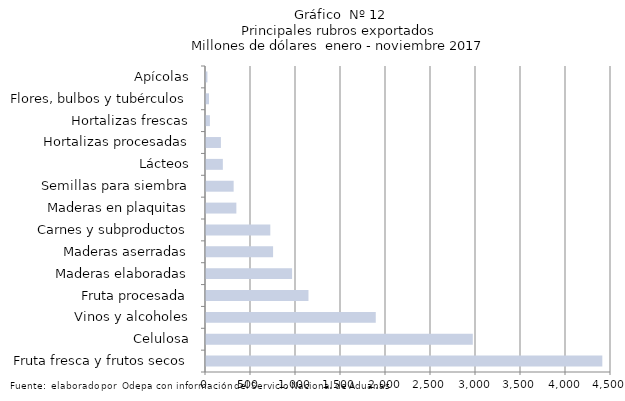
| Category | Series 7 |
|---|---|
| Fruta fresca y frutos secos | 4403623.028 |
| Celulosa | 2964485.207 |
| Vinos y alcoholes | 1886258.732 |
| Fruta procesada | 1138520.949 |
| Maderas elaboradas | 956483.218 |
| Maderas aserradas | 745342.011 |
| Carnes y subproductos | 714472.735 |
| Maderas en plaquitas | 337324.215 |
| Semillas para siembra | 307258.324 |
| Lácteos | 187262.054 |
| Hortalizas procesadas | 165551.657 |
| Hortalizas frescas | 43363.074 |
| Flores, bulbos y tubérculos | 33350.84 |
| Apícolas | 15855.019 |